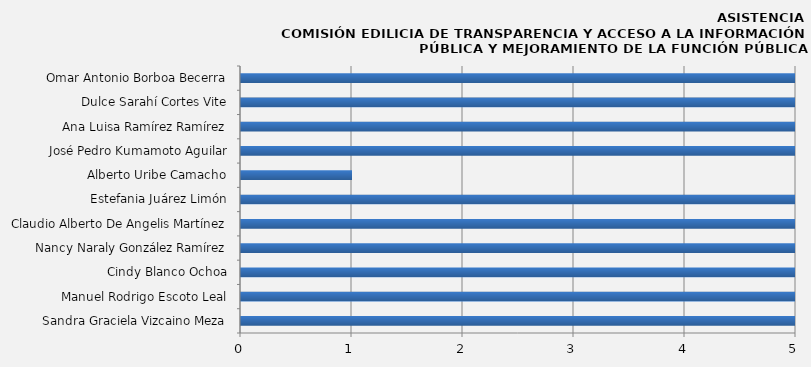
| Category | Sandra Graciela Vizcaino Meza |
|---|---|
| Sandra Graciela Vizcaino Meza | 13 |
| Manuel Rodrigo Escoto Leal | 13 |
| Cindy Blanco Ochoa | 10 |
| Nancy Naraly González Ramírez | 12 |
| Claudio Alberto De Angelis Martínez | 11 |
| Estefania Juárez Limón | 12 |
| Alberto Uribe Camacho | 1 |
| José Pedro Kumamoto Aguilar | 12 |
| Ana Luisa Ramírez Ramírez | 12 |
| Dulce Sarahí Cortes Vite | 10 |
| Omar Antonio Borboa Becerra | 11 |